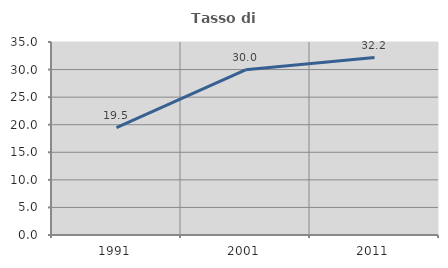
| Category | Tasso di occupazione   |
|---|---|
| 1991.0 | 19.457 |
| 2001.0 | 29.964 |
| 2011.0 | 32.173 |